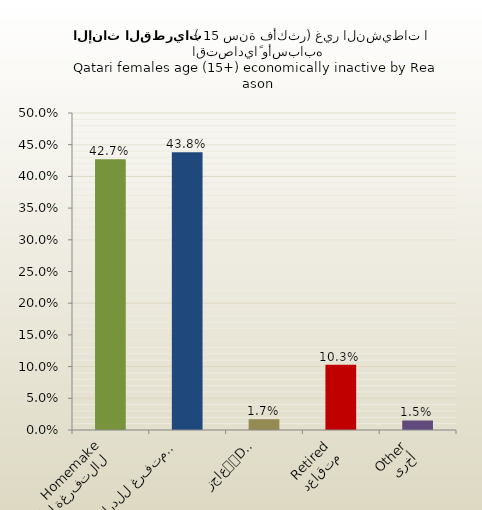
| Category | الاناث القطريات |
|---|---|
| التفرغة لأعمال المنزل
Homemaker | 0.427 |
| متفرغ للدراسة
Student | 0.438 |
| عاجز
Disabled | 0.017 |
| متقاعد
Retired | 0.103 |
| أخرى
Other | 0.015 |